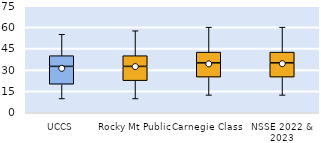
| Category | 25th | 50th | 75th |
|---|---|---|---|
| UCCS | 20 | 12.5 | 7.5 |
| Rocky Mt Public | 22.5 | 10 | 7.5 |
| Carnegie Class | 25 | 10 | 7.5 |
| NSSE 2022 & 2023 | 25 | 10 | 7.5 |